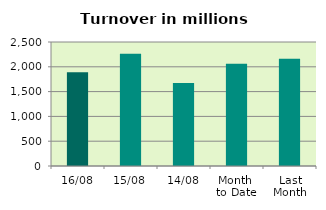
| Category | Series 0 |
|---|---|
| 16/08 | 1887.901 |
| 15/08 | 2260.749 |
| 14/08 | 1673.789 |
| Month 
to Date | 2063.152 |
| Last
Month | 2159.874 |